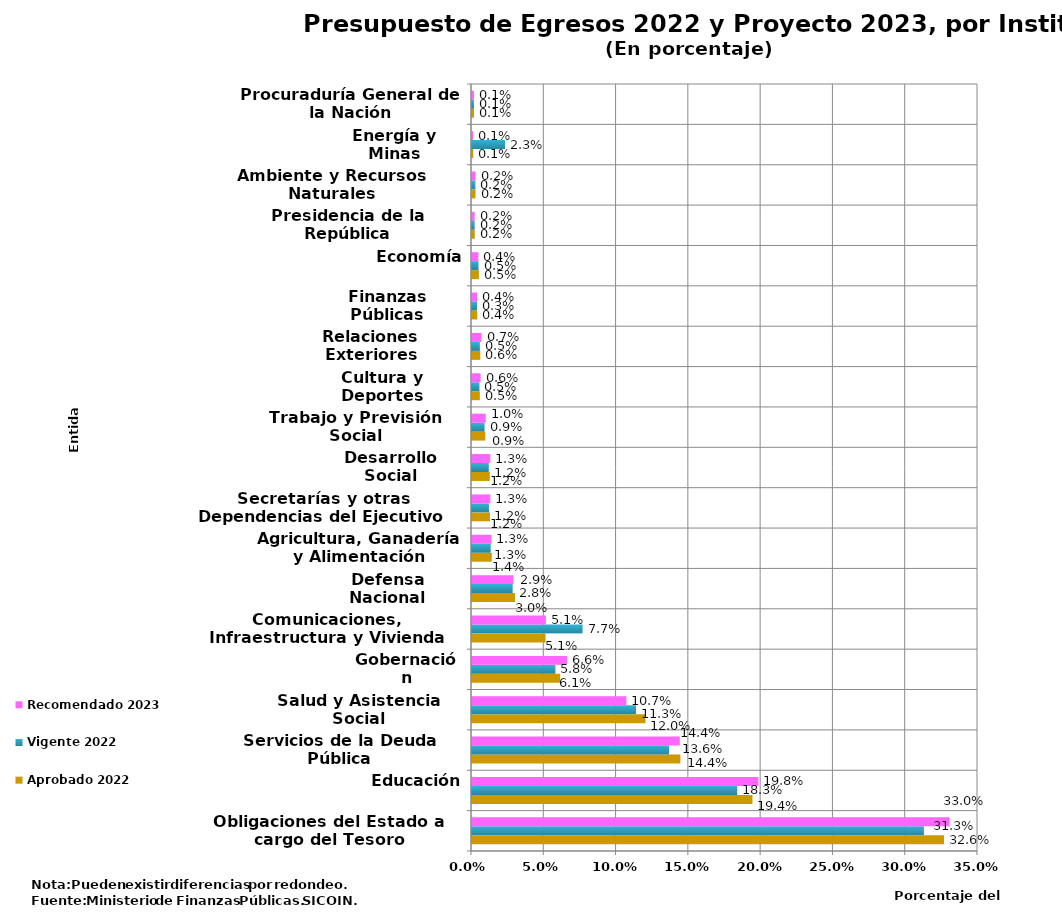
| Category | Aprobado 2022 | Vigente 2022 | Recomendado 2023 |
|---|---|---|---|
| Obligaciones del Estado a cargo del Tesoro | 0.326 | 0.313 | 0.33 |
| Educación | 0.194 | 0.183 | 0.198 |
| Servicios de la Deuda Pública | 0.144 | 0.136 | 0.144 |
| Salud y Asistencia Social | 0.12 | 0.113 | 0.107 |
| Gobernación | 0.061 | 0.058 | 0.066 |
| Comunicaciones, Infraestructura y Vivienda | 0.051 | 0.077 | 0.051 |
| Defensa Nacional | 0.03 | 0.028 | 0.029 |
| Agricultura, Ganadería y Alimentación | 0.014 | 0.013 | 0.013 |
| Secretarías y otras Dependencias del Ejecutivo | 0.012 | 0.012 | 0.013 |
| Desarrollo Social | 0.012 | 0.012 | 0.013 |
| Trabajo y Previsión Social | 0.009 | 0.009 | 0.01 |
| Cultura y Deportes | 0.005 | 0.005 | 0.006 |
| Relaciones Exteriores | 0.006 | 0.005 | 0.007 |
| Finanzas Públicas | 0.004 | 0.003 | 0.004 |
| Economía | 0.005 | 0.005 | 0.004 |
| Presidencia de la República | 0.002 | 0.002 | 0.002 |
| Ambiente y Recursos Naturales | 0.002 | 0.002 | 0.002 |
| Energía y Minas | 0.001 | 0.023 | 0.001 |
| Procuraduría General de la Nación | 0.001 | 0.001 | 0.001 |